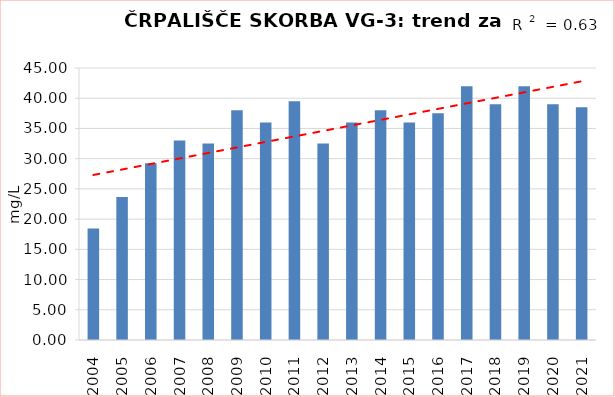
| Category | Vsota |
|---|---|
| 2004 | 18.467 |
| 2005 | 23.667 |
| 2006 | 29.25 |
| 2007 | 33 |
| 2008 | 32.5 |
| 2009 | 38 |
| 2010 | 36 |
| 2011 | 39.5 |
| 2012 | 32.5 |
| 2013 | 36 |
| 2014 | 38 |
| 2015 | 36 |
| 2016 | 37.5 |
| 2017 | 42 |
| 2018 | 39 |
| 2019 | 42 |
| 2020 | 39 |
| 2021 | 38.5 |